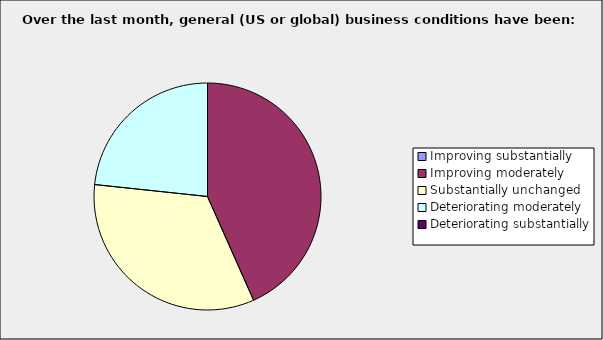
| Category | Series 0 |
|---|---|
| Improving substantially | 0 |
| Improving moderately | 0.433 |
| Substantially unchanged | 0.333 |
| Deteriorating moderately | 0.233 |
| Deteriorating substantially | 0 |